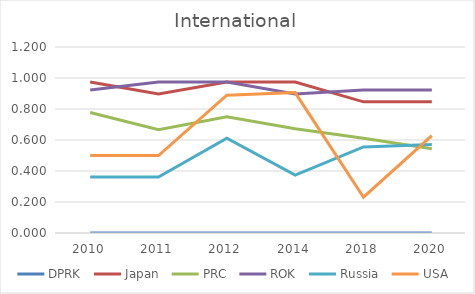
| Category | DPRK  | Japan  | PRC  | ROK  | Russia  | USA  |
|---|---|---|---|---|---|---|
| 2010.0 | 0 | 0.974 | 0.778 | 0.923 | 0.361 | 0.5 |
| 2011.0 | 0 | 0.897 | 0.667 | 0.974 | 0.361 | 0.5 |
| 2012.0 | 0 | 0.974 | 0.75 | 0.974 | 0.611 | 0.889 |
| 2014.0 | 0 | 0.974 | 0.673 | 0.897 | 0.373 | 0.906 |
| 2018.0 | 0 | 0.846 | 0.611 | 0.923 | 0.556 | 0.231 |
| 2020.0 | 0 | 0.846 | 0.543 | 0.923 | 0.571 | 0.629 |